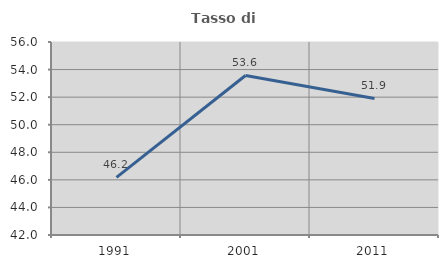
| Category | Tasso di occupazione   |
|---|---|
| 1991.0 | 46.18 |
| 2001.0 | 53.573 |
| 2011.0 | 51.906 |